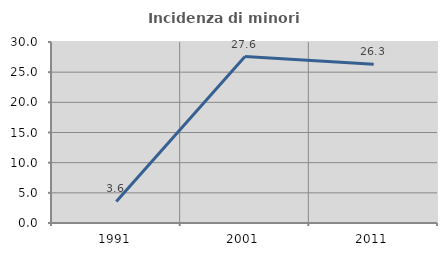
| Category | Incidenza di minori stranieri |
|---|---|
| 1991.0 | 3.571 |
| 2001.0 | 27.586 |
| 2011.0 | 26.293 |